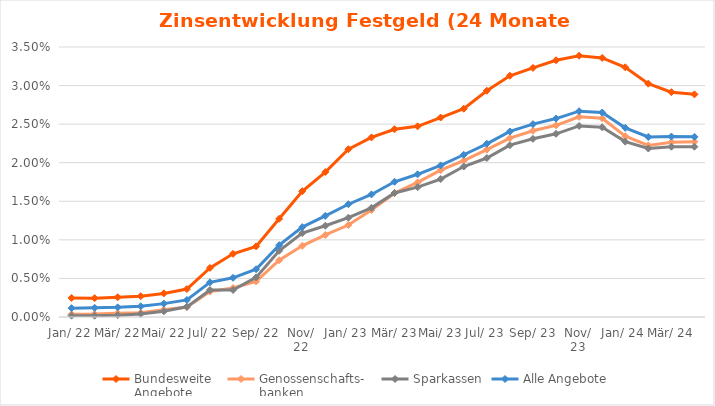
| Category | Bundesweite
Angebote | Genossenschafts-
banken | Sparkassen | Alle Angebote |
|---|---|---|---|---|
| Jan. 22 | 0.002 | 0 | 0 | 0.001 |
| Feb. 22 | 0.002 | 0 | 0 | 0.001 |
| Mrz. 22 | 0.003 | 0 | 0 | 0.001 |
| Apr. 22 | 0.003 | 0.001 | 0 | 0.001 |
| Mai. 22 | 0.003 | 0.001 | 0.001 | 0.002 |
| Jun. 22 | 0.004 | 0.001 | 0.001 | 0.002 |
| Jul. 22 | 0.006 | 0.003 | 0.003 | 0.004 |
| Aug. 22 | 0.008 | 0.004 | 0.004 | 0.005 |
| Sep. 22 | 0.009 | 0.005 | 0.005 | 0.006 |
| Okt. 22 | 0.013 | 0.007 | 0.009 | 0.009 |
| Nov. 22 | 0.016 | 0.009 | 0.011 | 0.012 |
| Dez. 22 | 0.019 | 0.011 | 0.012 | 0.013 |
| Jan. 23 | 0.022 | 0.012 | 0.013 | 0.015 |
| Feb. 23 | 0.023 | 0.014 | 0.014 | 0.016 |
| Mrz. 23 | 0.024 | 0.016 | 0.016 | 0.018 |
| Apr. 23 | 0.025 | 0.017 | 0.017 | 0.018 |
| Mai. 23 | 0.026 | 0.019 | 0.018 | 0.02 |
| Jun. 23 | 0.027 | 0.02 | 0.02 | 0.021 |
| Jul. 23 | 0.029 | 0.022 | 0.021 | 0.022 |
| Aug. 23 | 0.031 | 0.023 | 0.022 | 0.024 |
| Sep. 23 | 0.032 | 0.024 | 0.023 | 0.025 |
| Okt. 23 | 0.033 | 0.025 | 0.024 | 0.026 |
| Nov. 23 | 0.034 | 0.026 | 0.025 | 0.027 |
| Dez. 23 | 0.034 | 0.026 | 0.025 | 0.027 |
| Jan. 24 | 0.032 | 0.023 | 0.023 | 0.025 |
| Feb. 24 | 0.03 | 0.022 | 0.022 | 0.023 |
| Mrz. 24 | 0.029 | 0.023 | 0.022 | 0.023 |
| Akt. | 0.029 | 0.023 | 0.022 | 0.023 |